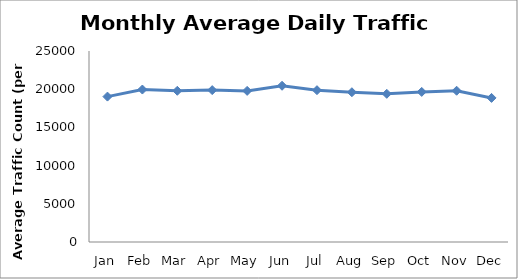
| Category | Series 0 |
|---|---|
| Jan | 19031 |
| Feb | 19954.75 |
| Mar | 19792.75 |
| Apr | 19879 |
| May | 19780.75 |
| Jun | 20451.5 |
| Jul | 19871.75 |
| Aug | 19603 |
| Sep | 19395.75 |
| Oct | 19645.75 |
| Nov | 19797.25 |
| Dec | 18859.5 |